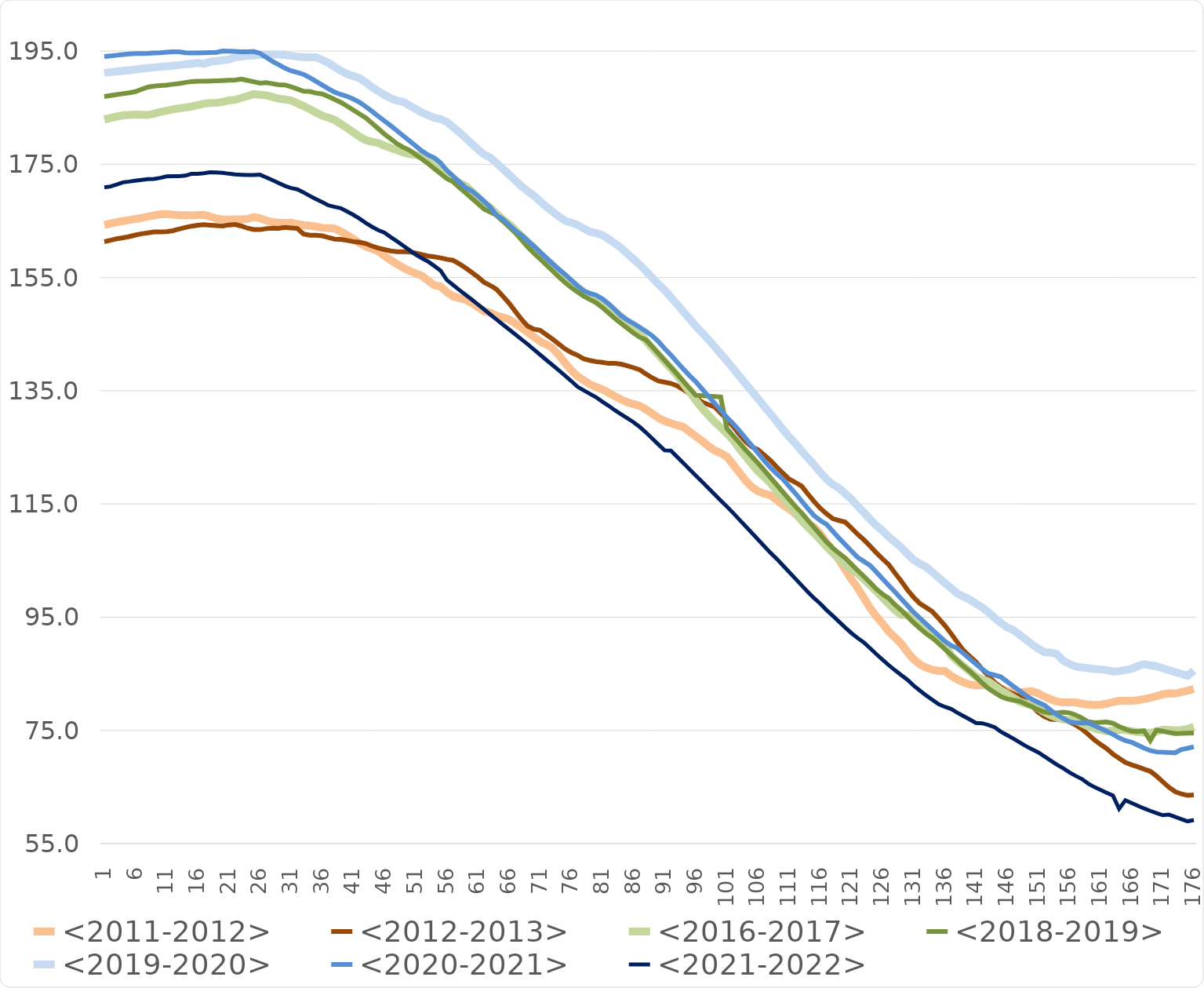
| Category | <2011-2012> | <2012-2013> | <2016-2017> | <2018-2019> | <2019-2020> | <2020-2021> | <2021-2022> |
|---|---|---|---|---|---|---|---|
| 1.0 | 164.28 | 161.325 | 182.89 | 186.966 | 191.146 | 194.044 | 170.933 |
| 2.0 | 164.523 | 161.574 | 183.183 | 187.153 | 191.28 | 194.151 | 171.078 |
| 3.0 | 164.768 | 161.839 | 183.434 | 187.307 | 191.392 | 194.264 | 171.438 |
| 4.0 | 164.958 | 162.014 | 183.638 | 187.474 | 191.501 | 194.377 | 171.813 |
| 5.0 | 165.149 | 162.228 | 183.717 | 187.626 | 191.621 | 194.494 | 171.944 |
| 6.0 | 165.348 | 162.505 | 183.777 | 187.833 | 191.754 | 194.574 | 172.102 |
| 7.0 | 165.545 | 162.725 | 183.762 | 188.248 | 191.89 | 194.576 | 172.243 |
| 8.0 | 165.768 | 162.892 | 183.729 | 188.643 | 192 | 194.606 | 172.367 |
| 9.0 | 165.968 | 163.041 | 183.946 | 188.816 | 192.115 | 194.661 | 172.42 |
| 10.0 | 166.179 | 163.072 | 184.252 | 188.909 | 192.208 | 194.707 | 172.601 |
| 11.0 | 166.21 | 163.081 | 184.461 | 188.983 | 192.298 | 194.791 | 172.871 |
| 12.0 | 166.105 | 163.273 | 184.693 | 189.134 | 192.412 | 194.88 | 172.916 |
| 13.0 | 166.006 | 163.557 | 184.886 | 189.262 | 192.533 | 194.863 | 172.911 |
| 14.0 | 166.005 | 163.846 | 185.021 | 189.452 | 192.666 | 194.698 | 172.997 |
| 15.0 | 165.96 | 164.072 | 185.181 | 189.617 | 192.762 | 194.674 | 173.305 |
| 16.0 | 166.032 | 164.247 | 185.448 | 189.659 | 192.877 | 194.675 | 173.301 |
| 17.0 | 166.08 | 164.347 | 185.707 | 189.659 | 192.749 | 194.69 | 173.409 |
| 18.0 | 165.748 | 164.248 | 185.811 | 189.694 | 193.116 | 194.725 | 173.6 |
| 19.0 | 165.401 | 164.161 | 185.869 | 189.741 | 193.241 | 194.762 | 173.563 |
| 20.0 | 165.276 | 164.094 | 186.018 | 189.785 | 193.375 | 195.014 | 173.49 |
| 21.0 | 165.24 | 164.282 | 186.276 | 189.839 | 193.51 | 194.983 | 173.335 |
| 22.0 | 165.259 | 164.372 | 186.39 | 189.89 | 193.906 | 194.946 | 173.207 |
| 23.0 | 165.278 | 164.101 | 186.736 | 190.044 | 194.019 | 194.876 | 173.155 |
| 24.0 | 165.334 | 163.72 | 187.044 | 189.81 | 194.139 | 194.875 | 173.121 |
| 25.0 | 165.681 | 163.473 | 187.403 | 189.578 | 194.251 | 194.927 | 173.108 |
| 26.0 | 165.472 | 163.458 | 187.287 | 189.344 | 194.304 | 194.594 | 173.16 |
| 27.0 | 165.06 | 163.628 | 187.195 | 189.431 | 194.346 | 193.894 | 172.685 |
| 28.0 | 164.8 | 163.709 | 186.89 | 189.239 | 194.395 | 193.186 | 172.202 |
| 29.0 | 164.68 | 163.679 | 186.606 | 189.053 | 194.382 | 192.605 | 171.691 |
| 30.0 | 164.662 | 163.84 | 186.442 | 189.021 | 194.306 | 191.974 | 171.193 |
| 31.0 | 164.696 | 163.753 | 186.273 | 188.699 | 194.157 | 191.521 | 170.798 |
| 32.0 | 164.442 | 163.674 | 185.771 | 188.309 | 194.023 | 191.207 | 170.576 |
| 33.0 | 164.24 | 162.689 | 185.302 | 187.895 | 193.942 | 190.887 | 170.035 |
| 34.0 | 164.159 | 162.475 | 184.726 | 187.86 | 193.903 | 190.303 | 169.423 |
| 35.0 | 164.002 | 162.482 | 184.146 | 187.577 | 193.897 | 189.646 | 168.84 |
| 36.0 | 163.765 | 162.363 | 183.583 | 187.423 | 193.438 | 189.003 | 168.324 |
| 37.0 | 163.701 | 162.056 | 183.211 | 186.962 | 192.899 | 188.35 | 167.755 |
| 38.0 | 163.642 | 161.787 | 182.843 | 186.45 | 192.214 | 187.744 | 167.47 |
| 39.0 | 163.148 | 161.744 | 182.125 | 185.941 | 191.507 | 187.32 | 167.248 |
| 40.0 | 162.507 | 161.55 | 181.415 | 185.28 | 190.949 | 187.009 | 166.657 |
| 41.0 | 161.822 | 161.341 | 180.646 | 184.568 | 190.579 | 186.522 | 166.07 |
| 42.0 | 161.073 | 161.212 | 179.88 | 183.888 | 190.211 | 185.963 | 165.386 |
| 43.0 | 160.49 | 161.002 | 179.277 | 183.19 | 189.465 | 185.195 | 164.635 |
| 44.0 | 160.07 | 160.555 | 178.976 | 182.258 | 188.629 | 184.34 | 163.963 |
| 45.0 | 159.669 | 160.195 | 178.774 | 181.303 | 187.926 | 183.485 | 163.377 |
| 46.0 | 158.816 | 159.941 | 178.288 | 180.341 | 187.252 | 182.661 | 162.91 |
| 47.0 | 158.058 | 159.703 | 177.902 | 179.514 | 186.639 | 181.825 | 162.14 |
| 48.0 | 157.385 | 159.564 | 177.493 | 178.645 | 186.262 | 180.936 | 161.408 |
| 49.0 | 156.729 | 159.558 | 177.1 | 178.012 | 186.032 | 180.042 | 160.629 |
| 50.0 | 156.154 | 159.525 | 176.803 | 177.492 | 185.393 | 179.156 | 159.848 |
| 51.0 | 155.738 | 159.333 | 176.634 | 176.728 | 184.775 | 178.262 | 159.065 |
| 52.0 | 155.297 | 159.06 | 176.458 | 175.923 | 184.128 | 177.368 | 158.416 |
| 53.0 | 154.462 | 158.796 | 176.08 | 175.14 | 183.698 | 176.654 | 157.835 |
| 54.0 | 153.648 | 158.656 | 175.319 | 174.218 | 183.211 | 176.136 | 157.044 |
| 55.0 | 153.394 | 158.472 | 174.332 | 173.363 | 182.986 | 175.252 | 156.245 |
| 56.0 | 152.44 | 158.224 | 173.32 | 172.474 | 182.497 | 173.957 | 154.587 |
| 57.0 | 151.708 | 158.039 | 172.376 | 171.93 | 181.602 | 172.946 | 153.699 |
| 58.0 | 151.371 | 157.429 | 171.735 | 170.924 | 180.675 | 171.925 | 152.817 |
| 59.0 | 151.118 | 156.706 | 171.193 | 169.997 | 179.667 | 170.903 | 151.973 |
| 60.0 | 150.496 | 155.915 | 170.25 | 169.017 | 178.66 | 170.308 | 151.138 |
| 61.0 | 149.787 | 155.105 | 169.221 | 168.064 | 177.642 | 169.436 | 150.25 |
| 62.0 | 149.055 | 154.155 | 168.177 | 167.082 | 176.739 | 168.419 | 149.364 |
| 63.0 | 148.783 | 153.588 | 167.304 | 166.532 | 176.172 | 167.404 | 148.472 |
| 64.0 | 148.249 | 152.91 | 166.292 | 165.994 | 175.228 | 166.036 | 147.575 |
| 65.0 | 147.932 | 151.729 | 165.29 | 165.006 | 174.224 | 165.324 | 146.7 |
| 66.0 | 147.606 | 150.491 | 164.434 | 163.952 | 173.213 | 164.317 | 145.825 |
| 67.0 | 146.904 | 149.047 | 163.392 | 162.9 | 172.168 | 163.33 | 144.964 |
| 68.0 | 146.144 | 147.613 | 162.358 | 161.656 | 171.148 | 162.506 | 144.086 |
| 69.0 | 145.326 | 146.426 | 161.311 | 160.407 | 170.258 | 161.497 | 143.221 |
| 70.0 | 144.531 | 145.887 | 160.264 | 159.286 | 169.468 | 160.545 | 142.289 |
| 71.0 | 143.686 | 145.68 | 159.179 | 158.28 | 168.461 | 159.487 | 141.365 |
| 72.0 | 143.184 | 144.9 | 158.19 | 157.221 | 167.504 | 158.441 | 140.428 |
| 73.0 | 142.495 | 144.112 | 157.227 | 156.174 | 166.634 | 157.403 | 139.519 |
| 74.0 | 141.311 | 143.253 | 156.112 | 155.108 | 165.794 | 156.446 | 138.598 |
| 75.0 | 139.927 | 142.39 | 155.035 | 154.122 | 165.038 | 155.558 | 137.659 |
| 76.0 | 138.616 | 141.749 | 154.21 | 153.221 | 164.7 | 154.524 | 136.716 |
| 77.0 | 137.564 | 141.277 | 153.305 | 152.44 | 164.302 | 153.52 | 135.7 |
| 78.0 | 136.869 | 140.637 | 152.461 | 151.705 | 163.651 | 152.633 | 135.062 |
| 79.0 | 136.122 | 140.352 | 151.76 | 151.12 | 163.099 | 152.212 | 134.454 |
| 80.0 | 135.659 | 140.131 | 151.224 | 150.539 | 162.824 | 151.868 | 133.837 |
| 81.0 | 135.215 | 140.011 | 150.686 | 149.706 | 162.484 | 151.233 | 133.06 |
| 82.0 | 134.636 | 139.82 | 149.846 | 148.728 | 161.795 | 150.365 | 132.347 |
| 83.0 | 134.026 | 139.827 | 148.965 | 147.769 | 161.038 | 149.346 | 131.557 |
| 84.0 | 133.464 | 139.696 | 148.096 | 146.891 | 160.215 | 148.244 | 130.854 |
| 85.0 | 132.98 | 139.419 | 147.134 | 146.071 | 159.236 | 147.5 | 130.162 |
| 86.0 | 132.64 | 139.079 | 146.28 | 145.196 | 158.247 | 146.909 | 129.45 |
| 87.0 | 132.33 | 138.688 | 145.083 | 144.462 | 157.264 | 146.22 | 128.603 |
| 88.0 | 131.681 | 137.967 | 143.819 | 143.982 | 156.144 | 145.488 | 127.629 |
| 89.0 | 130.959 | 137.276 | 142.535 | 142.797 | 154.962 | 144.704 | 126.552 |
| 90.0 | 130.205 | 136.724 | 141.357 | 141.587 | 153.801 | 143.691 | 125.514 |
| 91.0 | 129.646 | 136.519 | 140.121 | 140.373 | 152.783 | 142.426 | 124.47 |
| 92.0 | 129.268 | 136.297 | 138.984 | 139.158 | 151.54 | 141.31 | 124.41 |
| 93.0 | 128.901 | 135.872 | 137.714 | 137.932 | 150.269 | 140.043 | 123.327 |
| 94.0 | 128.59 | 135.206 | 136.264 | 136.684 | 148.989 | 138.85 | 122.224 |
| 95.0 | 127.781 | 134.426 | 134.78 | 135.436 | 147.711 | 137.667 | 121.129 |
| 96.0 | 126.947 | 133.724 | 133.304 | 134.213 | 146.43 | 136.613 | 120.019 |
| 97.0 | 126.146 | 132.997 | 131.943 | 134.116 | 145.25 | 135.341 | 118.944 |
| 98.0 | 125.26 | 132.563 | 130.715 | 134.042 | 144.095 | 134.071 | 117.832 |
| 99.0 | 124.481 | 132.156 | 129.536 | 133.992 | 142.825 | 132.838 | 116.724 |
| 100.0 | 123.978 | 131.066 | 128.514 | 133.898 | 141.542 | 131.573 | 115.612 |
| 101.0 | 123.371 | 129.99 | 127.447 | 128.326 | 140.272 | 130.308 | 114.538 |
| 102.0 | 121.942 | 128.678 | 126.269 | 127.056 | 138.918 | 129.185 | 113.414 |
| 103.0 | 120.548 | 127.289 | 124.79 | 125.826 | 137.56 | 127.96 | 112.235 |
| 104.0 | 119.158 | 126.034 | 123.45 | 124.551 | 136.229 | 126.62 | 111.066 |
| 105.0 | 118.024 | 125.088 | 122.039 | 123.387 | 134.953 | 125.311 | 109.89 |
| 106.0 | 117.22 | 124.596 | 120.786 | 122.209 | 133.597 | 123.998 | 108.709 |
| 107.0 | 116.828 | 123.647 | 119.751 | 120.946 | 132.242 | 122.658 | 107.535 |
| 108.0 | 116.537 | 122.696 | 118.698 | 119.665 | 130.905 | 121.416 | 106.374 |
| 109.0 | 115.679 | 121.535 | 117.288 | 118.395 | 129.553 | 120.334 | 105.306 |
| 110.0 | 114.825 | 120.446 | 116.044 | 117.106 | 128.189 | 119.375 | 104.146 |
| 111.0 | 114.112 | 119.39 | 114.753 | 115.823 | 126.855 | 118.113 | 102.969 |
| 112.0 | 113.241 | 118.797 | 113.401 | 114.577 | 125.695 | 116.871 | 101.806 |
| 113.0 | 112.302 | 118.155 | 112.06 | 113.423 | 124.346 | 115.531 | 100.629 |
| 114.0 | 111.5 | 116.77 | 110.897 | 112.137 | 123.15 | 114.198 | 99.469 |
| 115.0 | 110.894 | 115.448 | 109.837 | 110.875 | 121.904 | 112.944 | 98.365 |
| 116.0 | 109.73 | 114.241 | 108.664 | 109.587 | 120.565 | 112.082 | 97.384 |
| 117.0 | 108.188 | 113.268 | 107.456 | 108.318 | 119.396 | 111.411 | 96.259 |
| 118.0 | 106.711 | 112.411 | 106.353 | 107.228 | 118.46 | 110.19 | 95.256 |
| 119.0 | 105.132 | 112.08 | 105.28 | 106.291 | 117.798 | 108.964 | 94.214 |
| 120.0 | 103.42 | 111.801 | 104.305 | 105.469 | 116.821 | 107.831 | 93.178 |
| 121.0 | 101.706 | 110.732 | 103.5 | 104.371 | 115.839 | 106.702 | 92.19 |
| 122.0 | 100.163 | 109.634 | 102.744 | 103.272 | 114.636 | 105.569 | 91.314 |
| 123.0 | 98.419 | 108.676 | 101.681 | 102.215 | 113.498 | 104.854 | 90.544 |
| 124.0 | 96.634 | 107.558 | 100.651 | 101.106 | 112.299 | 104.141 | 89.513 |
| 125.0 | 95.161 | 106.385 | 99.582 | 99.964 | 111.218 | 102.984 | 88.476 |
| 126.0 | 93.878 | 105.309 | 98.473 | 99.057 | 110.292 | 101.784 | 87.49 |
| 127.0 | 92.453 | 104.288 | 97.332 | 98.329 | 109.201 | 100.609 | 86.522 |
| 128.0 | 91.396 | 102.788 | 96.237 | 97.198 | 108.275 | 99.46 | 85.626 |
| 129.0 | 90.328 | 101.374 | 95.416 | 96.255 | 107.33 | 98.249 | 84.77 |
| 130.0 | 88.823 | 99.838 | 95.401 | 95.142 | 106.149 | 97.051 | 83.946 |
| 131.0 | 87.559 | 98.495 | 94.34 | 94.03 | 105.12 | 95.868 | 82.911 |
| 132.0 | 86.621 | 97.4 | 93.37 | 93.044 | 104.443 | 94.844 | 82.035 |
| 133.0 | 86.094 | 96.704 | 92.499 | 92.091 | 103.864 | 93.818 | 81.181 |
| 134.0 | 85.708 | 95.982 | 91.582 | 91.352 | 102.964 | 92.793 | 80.402 |
| 135.0 | 85.493 | 94.792 | 90.928 | 90.386 | 101.992 | 91.767 | 79.639 |
| 136.0 | 85.492 | 93.544 | 90.273 | 89.382 | 101.04 | 90.783 | 79.162 |
| 137.0 | 84.663 | 92.111 | 88.236 | 88.35 | 100.156 | 90.009 | 78.788 |
| 138.0 | 84.01 | 90.598 | 87.235 | 87.351 | 99.22 | 89.504 | 78.14 |
| 139.0 | 83.504 | 89.135 | 86.347 | 86.335 | 98.613 | 88.587 | 77.528 |
| 140.0 | 83.13 | 88.077 | 85.439 | 85.453 | 98.115 | 87.634 | 76.935 |
| 141.0 | 82.929 | 87.119 | 84.504 | 84.451 | 97.381 | 86.72 | 76.321 |
| 142.0 | 82.999 | 85.819 | 84.01 | 83.378 | 96.752 | 85.835 | 76.254 |
| 143.0 | 83.099 | 84.631 | 83.658 | 82.412 | 95.871 | 85.064 | 75.96 |
| 144.0 | 82.843 | 83.519 | 82.895 | 81.7 | 94.883 | 84.77 | 75.546 |
| 145.0 | 82.396 | 82.649 | 82.074 | 80.993 | 93.991 | 84.449 | 74.779 |
| 146.0 | 81.971 | 81.905 | 81.471 | 80.567 | 93.221 | 83.626 | 74.172 |
| 147.0 | 81.79 | 81.46 | 80.798 | 80.335 | 92.734 | 82.807 | 73.564 |
| 148.0 | 81.696 | 80.99 | 80.109 | 80.162 | 91.907 | 81.993 | 72.896 |
| 149.0 | 81.813 | 80.18 | 79.725 | 79.665 | 91.055 | 81.173 | 72.236 |
| 150.0 | 81.924 | 79.264 | 79.42 | 79.19 | 90.202 | 80.49 | 71.677 |
| 151.0 | 81.556 | 78.197 | 78.875 | 78.648 | 89.46 | 79.959 | 71.113 |
| 152.0 | 80.955 | 77.449 | 78.25 | 78.246 | 88.822 | 79.446 | 70.396 |
| 153.0 | 80.508 | 76.972 | 77.684 | 78.078 | 88.764 | 78.597 | 69.676 |
| 154.0 | 80.109 | 76.916 | 77.235 | 78.092 | 88.487 | 77.754 | 68.959 |
| 155.0 | 79.942 | 76.89 | 76.931 | 78.223 | 87.348 | 77.125 | 68.318 |
| 156.0 | 79.942 | 76.503 | 76.843 | 78.1 | 86.73 | 76.536 | 67.6 |
| 157.0 | 79.942 | 75.956 | 76.758 | 77.746 | 86.269 | 76.318 | 66.974 |
| 158.0 | 79.711 | 75.247 | 76.226 | 77.179 | 86.117 | 76.322 | 66.428 |
| 159.0 | 79.573 | 74.341 | 75.738 | 76.555 | 85.987 | 76.331 | 65.624 |
| 160.0 | 79.491 | 73.348 | 75.342 | 76.348 | 85.853 | 75.852 | 65.002 |
| 161.0 | 79.534 | 72.522 | 75.069 | 76.428 | 85.789 | 75.326 | 64.481 |
| 162.0 | 79.704 | 71.79 | 74.843 | 76.482 | 85.656 | 74.853 | 63.977 |
| 163.0 | 80.014 | 70.82 | 74.991 | 76.261 | 85.403 | 74.314 | 63.49 |
| 164.0 | 80.225 | 70.071 | 75.182 | 75.678 | 85.46 | 73.68 | 61.152 |
| 165.0 | 80.225 | 69.337 | 75.043 | 75.2 | 85.652 | 73.195 | 62.66 |
| 166.0 | 80.198 | 68.909 | 74.87 | 74.848 | 85.878 | 72.916 | 62.172 |
| 167.0 | 80.332 | 68.573 | 74.707 | 74.783 | 86.356 | 72.395 | 61.689 |
| 168.0 | 80.534 | 68.148 | 74.602 | 74.935 | 86.702 | 71.872 | 61.212 |
| 169.0 | 80.765 | 67.783 | 74.576 | 73.199 | 86.5 | 71.431 | 60.787 |
| 170.0 | 81.037 | 66.933 | 74.808 | 75.064 | 86.3 | 71.201 | 60.402 |
| 171.0 | 81.371 | 65.937 | 75.092 | 74.856 | 85.985 | 71.135 | 60.022 |
| 172.0 | 81.535 | 64.963 | 75.086 | 74.638 | 85.629 | 71.096 | 60.119 |
| 173.0 | 81.505 | 64.177 | 75.005 | 74.442 | 85.298 | 71.057 | 59.724 |
| 174.0 | 81.77 | 63.776 | 75.069 | 74.464 | 84.972 | 71.632 | 59.321 |
| 175.0 | 82.019 | 63.516 | 75.253 | 74.51 | 84.646 | 71.85 | 58.945 |
| 176.0 | 82.326 | 63.591 | 75.645 | 74.557 | 85.57 | 72.098 | 59.16 |